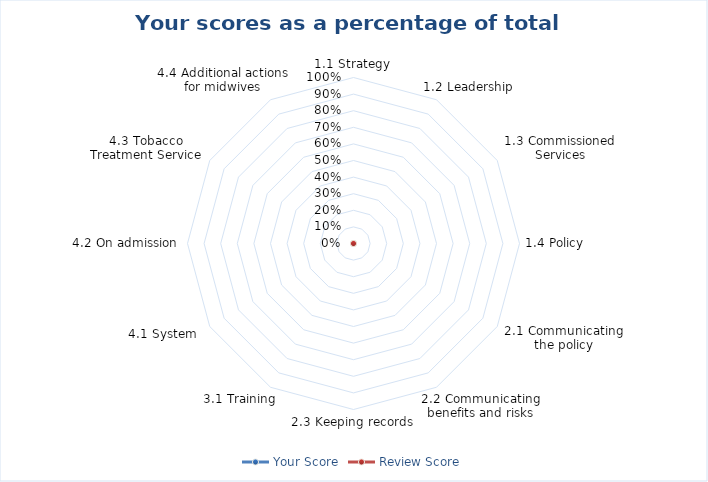
| Category | Your Score | Review Score |
|---|---|---|
| 1.1 Strategy | 0 | 0 |
| 1.2 Leadership | 0 | 0 |
| 1.3 Commissioned Services | 0 | 0 |
| 1.4 Policy | 0 | 0 |
| 2.1 Communicating the policy | 0 | 0 |
| 2.2 Communicating benefits and risks | 0 | 0 |
| 2.3 Keeping records | 0 | 0 |
| 3.1 Training | 0 | 0 |
| 4.1 System  | 0 | 0 |
| 4.2 On admission | 0 | 0 |
| 4.3 Tobacco Treatment Service | 0 | 0 |
| 4.4 Additional actions for midwives | 0 | 0 |